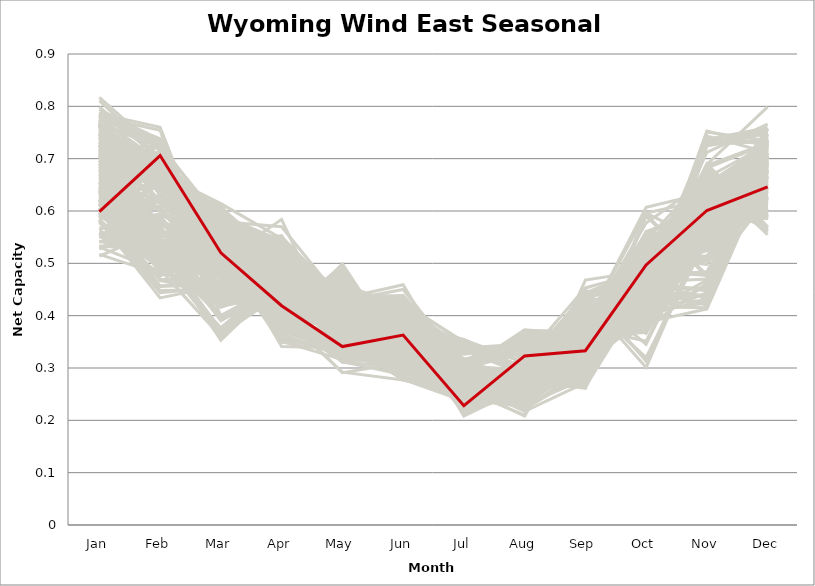
| Category | sample_001 | sample_002 | sample_003 | sample_004 | sample_005 | sample_006 | sample_007 | sample_008 | sample_009 | sample_010 | sample_011 | sample_012 | sample_013 | sample_014 | sample_015 | sample_016 | sample_017 | sample_018 | sample_019 | sample_020 | sample_021 | sample_022 | sample_023 | sample_024 | sample_025 | sample_026 | sample_027 | sample_028 | sample_029 | sample_030 | sample_031 | sample_032 | sample_033 | sample_034 | sample_035 | sample_036 | sample_037 | sample_038 | sample_039 | sample_040 | sample_041 | sample_042 | sample_043 | sample_044 | sample_045 | sample_046 | sample_047 | sample_048 | sample_049 | sample_050 | sample_051 | sample_052 | sample_053 | sample_054 | sample_055 | sample_056 | sample_057 | sample_058 | sample_059 | sample_060 | sample_061 | sample_062 | sample_063 | sample_064 | sample_065 | sample_066 | sample_067 | sample_068 | sample_069 | sample_070 | sample_071 | sample_072 | sample_073 | sample_074 | sample_075 | sample_076 | sample_077 | sample_078 | sample_079 | sample_080 | sample_081 | sample_082 | sample_083 | sample_084 | sample_085 | sample_086 | sample_087 | sample_088 | sample_089 | sample_090 | sample_091 | sample_092 | sample_093 | sample_094 | sample_095 | sample_096 | sample_097 | sample_098 | sample_099 | sample_100 | sample_101 | sample_102 | sample_103 | sample_104 | sample_105 | sample_106 | sample_107 | sample_108 | sample_109 | sample_110 | sample_111 | sample_112 | sample_113 | sample_114 | sample_115 | sample_116 | sample_117 | sample_118 | sample_119 | sample_120 | sample_121 | sample_122 | sample_123 | sample_124 | sample_125 | sample_126 | sample_127 | sample_128 | sample_129 | sample_130 | sample_131 | sample_132 | sample_133 | sample_134 | sample_135 | sample_136 | sample_137 | sample_138 | sample_139 | sample_140 | sample_141 | sample_142 | sample_143 | sample_144 | sample_145 | sample_146 | sample_147 | sample_148 | sample_149 | sample_150 | sample_151 | sample_152 | sample_153 | sample_154 | sample_155 | sample_156 | sample_157 | sample_158 | sample_159 | sample_160 | sample_161 | sample_162 | sample_163 | sample_164 | sample_165 | sample_166 | sample_167 | sample_168 | sample_169 | sample_170 | sample_171 | sample_172 | sample_173 | sample_174 | sample_175 | sample_176 | sample_177 | sample_178 | sample_179 | sample_180 | sample_181 | sample_182 | sample_183 | sample_184 | sample_185 | sample_186 | sample_187 | sample_188 | sample_189 | sample_190 | sample_191 | sample_192 | sample_193 | sample_194 | sample_195 | sample_196 | sample_197 | sample_198 | sample_199 | sample_200 | sample_201 | sample_202 | sample_203 | sample_204 | sample_205 | sample_206 | sample_207 | sample_208 | sample_209 | sample_210 | sample_211 | sample_212 | sample_213 | sample_214 | sample_215 | sample_216 | sample_217 | sample_218 | sample_219 | sample_220 | sample_221 | sample_222 | sample_223 | sample_224 | sample_225 | sample_226 | sample_227 | sample_228 | sample_229 | sample_230 | sample_231 | sample_232 | sample_233 | sample_234 | sample_235 | sample_236 | sample_237 | sample_238 | sample_239 | sample_240 | sample_241 | sample_242 | sample_243 | sample_244 | sample_245 | sample_246 | sample_248 | sample_249 | sample_250 | sample_247 |
|---|---|---|---|---|---|---|---|---|---|---|---|---|---|---|---|---|---|---|---|---|---|---|---|---|---|---|---|---|---|---|---|---|---|---|---|---|---|---|---|---|---|---|---|---|---|---|---|---|---|---|---|---|---|---|---|---|---|---|---|---|---|---|---|---|---|---|---|---|---|---|---|---|---|---|---|---|---|---|---|---|---|---|---|---|---|---|---|---|---|---|---|---|---|---|---|---|---|---|---|---|---|---|---|---|---|---|---|---|---|---|---|---|---|---|---|---|---|---|---|---|---|---|---|---|---|---|---|---|---|---|---|---|---|---|---|---|---|---|---|---|---|---|---|---|---|---|---|---|---|---|---|---|---|---|---|---|---|---|---|---|---|---|---|---|---|---|---|---|---|---|---|---|---|---|---|---|---|---|---|---|---|---|---|---|---|---|---|---|---|---|---|---|---|---|---|---|---|---|---|---|---|---|---|---|---|---|---|---|---|---|---|---|---|---|---|---|---|---|---|---|---|---|---|---|---|---|---|---|---|---|---|---|---|---|---|---|---|---|---|---|---|---|---|---|---|---|---|---|---|---|
| Jan | 0.687 | 0.639 | 0.761 | 0.761 | 0.686 | 0.67 | 0.596 | 0.608 | 0.719 | 0.738 | 0.794 | 0.636 | 0.711 | 0.769 | 0.618 | 0.581 | 0.551 | 0.711 | 0.587 | 0.767 | 0.692 | 0.613 | 0.584 | 0.584 | 0.602 | 0.644 | 0.75 | 0.753 | 0.583 | 0.78 | 0.705 | 0.767 | 0.54 | 0.733 | 0.623 | 0.639 | 0.621 | 0.578 | 0.646 | 0.641 | 0.751 | 0.717 | 0.75 | 0.582 | 0.789 | 0.622 | 0.617 | 0.593 | 0.71 | 0.652 | 0.638 | 0.637 | 0.671 | 0.696 | 0.551 | 0.639 | 0.62 | 0.782 | 0.752 | 0.763 | 0.532 | 0.542 | 0.616 | 0.799 | 0.649 | 0.765 | 0.756 | 0.559 | 0.531 | 0.726 | 0.71 | 0.674 | 0.751 | 0.714 | 0.69 | 0.787 | 0.747 | 0.732 | 0.718 | 0.718 | 0.593 | 0.722 | 0.747 | 0.609 | 0.666 | 0.746 | 0.718 | 0.751 | 0.733 | 0.742 | 0.731 | 0.614 | 0.615 | 0.615 | 0.746 | 0.817 | 0.592 | 0.717 | 0.658 | 0.654 | 0.731 | 0.65 | 0.766 | 0.765 | 0.754 | 0.756 | 0.623 | 0.634 | 0.527 | 0.639 | 0.618 | 0.599 | 0.629 | 0.6 | 0.724 | 0.71 | 0.771 | 0.747 | 0.775 | 0.739 | 0.777 | 0.671 | 0.558 | 0.635 | 0.621 | 0.613 | 0.737 | 0.678 | 0.722 | 0.727 | 0.591 | 0.727 | 0.662 | 0.589 | 0.735 | 0.672 | 0.622 | 0.675 | 0.686 | 0.708 | 0.647 | 0.641 | 0.756 | 0.625 | 0.707 | 0.766 | 0.728 | 0.74 | 0.782 | 0.597 | 0.594 | 0.606 | 0.778 | 0.627 | 0.588 | 0.657 | 0.587 | 0.731 | 0.746 | 0.67 | 0.533 | 0.612 | 0.713 | 0.688 | 0.697 | 0.604 | 0.702 | 0.601 | 0.607 | 0.633 | 0.685 | 0.666 | 0.708 | 0.761 | 0.724 | 0.681 | 0.715 | 0.787 | 0.677 | 0.656 | 0.596 | 0.706 | 0.655 | 0.784 | 0.72 | 0.743 | 0.72 | 0.707 | 0.732 | 0.655 | 0.563 | 0.586 | 0.786 | 0.663 | 0.56 | 0.618 | 0.583 | 0.605 | 0.589 | 0.719 | 0.705 | 0.542 | 0.69 | 0.673 | 0.517 | 0.724 | 0.748 | 0.73 | 0.615 | 0.689 | 0.733 | 0.643 | 0.588 | 0.697 | 0.759 | 0.632 | 0.766 | 0.514 | 0.615 | 0.625 | 0.78 | 0.678 | 0.551 | 0.733 | 0.706 | 0.725 | 0.766 | 0.708 | 0.708 | 0.6 | 0.658 | 0.725 | 0.725 | 0.811 | 0.745 | 0.567 | 0.748 | 0.677 | 0.697 | 0.587 | 0.595 | 0.751 | 0.602 | 0.763 | 0.661 | 0.62 | 0.733 | 0.639 | 0.785 | 0.599 |
| Feb | 0.668 | 0.511 | 0.691 | 0.676 | 0.677 | 0.713 | 0.509 | 0.699 | 0.709 | 0.601 | 0.736 | 0.538 | 0.663 | 0.681 | 0.715 | 0.434 | 0.624 | 0.652 | 0.692 | 0.727 | 0.538 | 0.524 | 0.444 | 0.651 | 0.659 | 0.519 | 0.671 | 0.66 | 0.47 | 0.754 | 0.574 | 0.522 | 0.592 | 0.664 | 0.512 | 0.541 | 0.489 | 0.456 | 0.528 | 0.673 | 0.662 | 0.66 | 0.683 | 0.476 | 0.718 | 0.508 | 0.712 | 0.69 | 0.529 | 0.497 | 0.53 | 0.528 | 0.614 | 0.674 | 0.514 | 0.698 | 0.697 | 0.738 | 0.679 | 0.527 | 0.542 | 0.516 | 0.528 | 0.697 | 0.582 | 0.617 | 0.639 | 0.501 | 0.485 | 0.648 | 0.671 | 0.57 | 0.683 | 0.505 | 0.519 | 0.725 | 0.486 | 0.66 | 0.725 | 0.573 | 0.698 | 0.702 | 0.662 | 0.713 | 0.581 | 0.681 | 0.561 | 0.674 | 0.684 | 0.505 | 0.672 | 0.542 | 0.496 | 0.488 | 0.663 | 0.714 | 0.687 | 0.518 | 0.67 | 0.512 | 0.639 | 0.712 | 0.722 | 0.485 | 0.679 | 0.701 | 0.502 | 0.521 | 0.594 | 0.682 | 0.585 | 0.706 | 0.671 | 0.691 | 0.657 | 0.559 | 0.521 | 0.688 | 0.515 | 0.648 | 0.725 | 0.493 | 0.48 | 0.536 | 0.505 | 0.467 | 0.647 | 0.509 | 0.662 | 0.67 | 0.698 | 0.55 | 0.681 | 0.653 | 0.676 | 0.67 | 0.537 | 0.669 | 0.599 | 0.662 | 0.512 | 0.518 | 0.683 | 0.703 | 0.683 | 0.667 | 0.654 | 0.68 | 0.676 | 0.539 | 0.495 | 0.513 | 0.694 | 0.521 | 0.688 | 0.7 | 0.569 | 0.653 | 0.67 | 0.708 | 0.525 | 0.658 | 0.686 | 0.657 | 0.555 | 0.457 | 0.571 | 0.448 | 0.456 | 0.694 | 0.504 | 0.529 | 0.525 | 0.521 | 0.616 | 0.524 | 0.709 | 0.704 | 0.508 | 0.5 | 0.49 | 0.52 | 0.534 | 0.63 | 0.689 | 0.69 | 0.523 | 0.64 | 0.664 | 0.622 | 0.629 | 0.631 | 0.76 | 0.643 | 0.542 | 0.488 | 0.489 | 0.469 | 0.532 | 0.69 | 0.544 | 0.531 | 0.556 | 0.729 | 0.479 | 0.647 | 0.674 | 0.639 | 0.66 | 0.725 | 0.669 | 0.503 | 0.607 | 0.544 | 0.67 | 0.489 | 0.532 | 0.564 | 0.488 | 0.618 | 0.652 | 0.649 | 0.518 | 0.659 | 0.654 | 0.647 | 0.646 | 0.711 | 0.662 | 0.609 | 0.726 | 0.574 | 0.533 | 0.702 | 0.679 | 0.595 | 0.658 | 0.684 | 0.545 | 0.704 | 0.685 | 0.67 | 0.486 | 0.506 | 0.538 | 0.529 | 0.659 | 0.522 | 0.731 | 0.706 |
| Mar | 0.482 | 0.517 | 0.428 | 0.542 | 0.529 | 0.56 | 0.364 | 0.539 | 0.579 | 0.524 | 0.435 | 0.4 | 0.538 | 0.399 | 0.535 | 0.458 | 0.537 | 0.52 | 0.526 | 0.435 | 0.529 | 0.367 | 0.455 | 0.558 | 0.565 | 0.459 | 0.565 | 0.59 | 0.466 | 0.433 | 0.528 | 0.555 | 0.429 | 0.573 | 0.512 | 0.393 | 0.438 | 0.478 | 0.432 | 0.512 | 0.559 | 0.577 | 0.548 | 0.523 | 0.447 | 0.366 | 0.534 | 0.527 | 0.582 | 0.499 | 0.361 | 0.353 | 0.548 | 0.535 | 0.527 | 0.519 | 0.533 | 0.479 | 0.603 | 0.584 | 0.393 | 0.487 | 0.4 | 0.505 | 0.439 | 0.611 | 0.5 | 0.543 | 0.485 | 0.536 | 0.566 | 0.435 | 0.567 | 0.602 | 0.534 | 0.441 | 0.606 | 0.58 | 0.581 | 0.535 | 0.561 | 0.57 | 0.52 | 0.537 | 0.537 | 0.602 | 0.549 | 0.525 | 0.584 | 0.553 | 0.614 | 0.39 | 0.477 | 0.432 | 0.562 | 0.497 | 0.527 | 0.605 | 0.535 | 0.503 | 0.502 | 0.539 | 0.429 | 0.575 | 0.582 | 0.57 | 0.377 | 0.514 | 0.392 | 0.527 | 0.468 | 0.515 | 0.513 | 0.541 | 0.521 | 0.524 | 0.573 | 0.571 | 0.575 | 0.59 | 0.423 | 0.523 | 0.542 | 0.51 | 0.441 | 0.448 | 0.56 | 0.511 | 0.571 | 0.571 | 0.523 | 0.551 | 0.549 | 0.552 | 0.576 | 0.574 | 0.365 | 0.59 | 0.491 | 0.562 | 0.515 | 0.437 | 0.555 | 0.55 | 0.545 | 0.607 | 0.541 | 0.577 | 0.418 | 0.355 | 0.451 | 0.398 | 0.43 | 0.442 | 0.556 | 0.54 | 0.433 | 0.576 | 0.549 | 0.568 | 0.495 | 0.485 | 0.55 | 0.524 | 0.556 | 0.456 | 0.553 | 0.45 | 0.463 | 0.534 | 0.569 | 0.514 | 0.529 | 0.582 | 0.527 | 0.571 | 0.554 | 0.441 | 0.53 | 0.517 | 0.417 | 0.547 | 0.522 | 0.594 | 0.589 | 0.592 | 0.557 | 0.504 | 0.558 | 0.523 | 0.528 | 0.515 | 0.463 | 0.58 | 0.513 | 0.417 | 0.57 | 0.448 | 0.369 | 0.596 | 0.538 | 0.416 | 0.562 | 0.57 | 0.502 | 0.561 | 0.593 | 0.502 | 0.575 | 0.578 | 0.522 | 0.51 | 0.479 | 0.527 | 0.553 | 0.418 | 0.555 | 0.418 | 0.36 | 0.483 | 0.42 | 0.535 | 0.489 | 0.559 | 0.522 | 0.549 | 0.612 | 0.544 | 0.538 | 0.472 | 0.504 | 0.529 | 0.586 | 0.51 | 0.574 | 0.526 | 0.553 | 0.543 | 0.525 | 0.523 | 0.548 | 0.581 | 0.541 | 0.568 | 0.542 | 0.373 | 0.551 | 0.529 | 0.435 | 0.52 |
| Apr | 0.447 | 0.434 | 0.447 | 0.416 | 0.514 | 0.505 | 0.442 | 0.358 | 0.526 | 0.455 | 0.452 | 0.457 | 0.395 | 0.434 | 0.406 | 0.472 | 0.463 | 0.427 | 0.403 | 0.464 | 0.395 | 0.461 | 0.467 | 0.402 | 0.415 | 0.461 | 0.518 | 0.518 | 0.49 | 0.459 | 0.397 | 0.46 | 0.427 | 0.429 | 0.402 | 0.455 | 0.463 | 0.478 | 0.451 | 0.388 | 0.538 | 0.498 | 0.397 | 0.364 | 0.449 | 0.454 | 0.415 | 0.351 | 0.386 | 0.382 | 0.458 | 0.465 | 0.479 | 0.545 | 0.374 | 0.385 | 0.37 | 0.493 | 0.495 | 0.498 | 0.437 | 0.415 | 0.463 | 0.509 | 0.482 | 0.432 | 0.461 | 0.369 | 0.419 | 0.553 | 0.404 | 0.465 | 0.517 | 0.396 | 0.39 | 0.456 | 0.399 | 0.507 | 0.51 | 0.413 | 0.409 | 0.508 | 0.439 | 0.377 | 0.463 | 0.5 | 0.428 | 0.426 | 0.454 | 0.448 | 0.547 | 0.457 | 0.457 | 0.462 | 0.537 | 0.515 | 0.417 | 0.392 | 0.493 | 0.392 | 0.427 | 0.546 | 0.469 | 0.45 | 0.522 | 0.524 | 0.475 | 0.399 | 0.446 | 0.364 | 0.488 | 0.411 | 0.349 | 0.341 | 0.418 | 0.393 | 0.501 | 0.515 | 0.479 | 0.441 | 0.456 | 0.382 | 0.376 | 0.428 | 0.473 | 0.463 | 0.497 | 0.392 | 0.409 | 0.422 | 0.417 | 0.427 | 0.531 | 0.422 | 0.503 | 0.527 | 0.456 | 0.528 | 0.412 | 0.416 | 0.391 | 0.454 | 0.546 | 0.385 | 0.41 | 0.504 | 0.53 | 0.446 | 0.444 | 0.492 | 0.476 | 0.445 | 0.45 | 0.467 | 0.419 | 0.541 | 0.399 | 0.485 | 0.548 | 0.46 | 0.398 | 0.393 | 0.414 | 0.526 | 0.457 | 0.462 | 0.462 | 0.466 | 0.478 | 0.412 | 0.38 | 0.405 | 0.4 | 0.463 | 0.439 | 0.409 | 0.506 | 0.454 | 0.405 | 0.368 | 0.452 | 0.378 | 0.404 | 0.443 | 0.536 | 0.543 | 0.449 | 0.401 | 0.533 | 0.466 | 0.47 | 0.493 | 0.485 | 0.57 | 0.393 | 0.456 | 0.366 | 0.473 | 0.486 | 0.515 | 0.376 | 0.461 | 0.458 | 0.508 | 0.373 | 0.491 | 0.434 | 0.407 | 0.42 | 0.529 | 0.404 | 0.391 | 0.481 | 0.394 | 0.549 | 0.452 | 0.451 | 0.441 | 0.47 | 0.516 | 0.459 | 0.506 | 0.407 | 0.536 | 0.503 | 0.508 | 0.459 | 0.523 | 0.53 | 0.487 | 0.584 | 0.438 | 0.413 | 0.485 | 0.527 | 0.466 | 0.538 | 0.523 | 0.399 | 0.372 | 0.354 | 0.448 | 0.369 | 0.444 | 0.406 | 0.483 | 0.551 | 0.405 | 0.461 | 0.419 |
| May | 0.415 | 0.454 | 0.349 | 0.333 | 0.371 | 0.447 | 0.465 | 0.33 | 0.441 | 0.339 | 0.381 | 0.434 | 0.361 | 0.353 | 0.334 | 0.398 | 0.376 | 0.312 | 0.325 | 0.385 | 0.466 | 0.466 | 0.403 | 0.34 | 0.312 | 0.375 | 0.436 | 0.426 | 0.403 | 0.368 | 0.434 | 0.389 | 0.427 | 0.393 | 0.479 | 0.429 | 0.411 | 0.388 | 0.393 | 0.318 | 0.435 | 0.411 | 0.356 | 0.426 | 0.35 | 0.461 | 0.33 | 0.316 | 0.345 | 0.499 | 0.462 | 0.465 | 0.341 | 0.373 | 0.433 | 0.314 | 0.331 | 0.337 | 0.417 | 0.365 | 0.395 | 0.389 | 0.421 | 0.326 | 0.399 | 0.422 | 0.356 | 0.441 | 0.384 | 0.37 | 0.37 | 0.375 | 0.416 | 0.322 | 0.486 | 0.375 | 0.347 | 0.416 | 0.435 | 0.438 | 0.322 | 0.43 | 0.323 | 0.34 | 0.355 | 0.424 | 0.33 | 0.32 | 0.397 | 0.374 | 0.407 | 0.449 | 0.409 | 0.413 | 0.372 | 0.35 | 0.337 | 0.313 | 0.388 | 0.497 | 0.352 | 0.349 | 0.374 | 0.402 | 0.428 | 0.431 | 0.448 | 0.469 | 0.436 | 0.324 | 0.38 | 0.32 | 0.338 | 0.338 | 0.328 | 0.47 | 0.36 | 0.421 | 0.371 | 0.405 | 0.378 | 0.48 | 0.429 | 0.454 | 0.409 | 0.406 | 0.394 | 0.489 | 0.376 | 0.383 | 0.33 | 0.332 | 0.364 | 0.322 | 0.434 | 0.374 | 0.452 | 0.403 | 0.439 | 0.388 | 0.483 | 0.402 | 0.428 | 0.345 | 0.373 | 0.443 | 0.428 | 0.401 | 0.356 | 0.448 | 0.409 | 0.445 | 0.349 | 0.372 | 0.323 | 0.348 | 0.292 | 0.404 | 0.429 | 0.438 | 0.414 | 0.325 | 0.363 | 0.384 | 0.348 | 0.386 | 0.358 | 0.4 | 0.419 | 0.327 | 0.327 | 0.494 | 0.458 | 0.364 | 0.433 | 0.311 | 0.437 | 0.351 | 0.477 | 0.486 | 0.418 | 0.47 | 0.466 | 0.409 | 0.315 | 0.427 | 0.356 | 0.329 | 0.418 | 0.334 | 0.371 | 0.37 | 0.35 | 0.426 | 0.421 | 0.404 | 0.418 | 0.404 | 0.451 | 0.366 | 0.458 | 0.392 | 0.363 | 0.434 | 0.425 | 0.421 | 0.4 | 0.336 | 0.334 | 0.441 | 0.344 | 0.478 | 0.36 | 0.469 | 0.432 | 0.406 | 0.392 | 0.401 | 0.447 | 0.362 | 0.344 | 0.391 | 0.408 | 0.428 | 0.39 | 0.37 | 0.419 | 0.425 | 0.37 | 0.368 | 0.334 | 0.343 | 0.342 | 0.358 | 0.412 | 0.4 | 0.442 | 0.366 | 0.459 | 0.341 | 0.338 | 0.408 | 0.426 | 0.381 | 0.291 | 0.456 | 0.431 | 0.468 | 0.377 | 0.341 |
| Jun | 0.362 | 0.326 | 0.283 | 0.295 | 0.372 | 0.379 | 0.393 | 0.338 | 0.43 | 0.308 | 0.297 | 0.386 | 0.311 | 0.277 | 0.363 | 0.357 | 0.369 | 0.287 | 0.364 | 0.299 | 0.357 | 0.402 | 0.355 | 0.382 | 0.363 | 0.385 | 0.405 | 0.419 | 0.359 | 0.285 | 0.431 | 0.37 | 0.383 | 0.299 | 0.322 | 0.379 | 0.368 | 0.362 | 0.373 | 0.316 | 0.412 | 0.407 | 0.306 | 0.341 | 0.283 | 0.397 | 0.363 | 0.341 | 0.304 | 0.322 | 0.406 | 0.393 | 0.368 | 0.386 | 0.39 | 0.349 | 0.346 | 0.343 | 0.4 | 0.404 | 0.387 | 0.369 | 0.364 | 0.352 | 0.32 | 0.293 | 0.302 | 0.345 | 0.376 | 0.389 | 0.317 | 0.313 | 0.414 | 0.325 | 0.335 | 0.281 | 0.303 | 0.41 | 0.42 | 0.438 | 0.363 | 0.399 | 0.306 | 0.339 | 0.369 | 0.413 | 0.312 | 0.302 | 0.314 | 0.371 | 0.435 | 0.388 | 0.377 | 0.367 | 0.396 | 0.351 | 0.364 | 0.321 | 0.377 | 0.323 | 0.303 | 0.366 | 0.278 | 0.376 | 0.45 | 0.424 | 0.413 | 0.319 | 0.371 | 0.352 | 0.363 | 0.355 | 0.349 | 0.329 | 0.309 | 0.368 | 0.403 | 0.439 | 0.367 | 0.301 | 0.28 | 0.319 | 0.35 | 0.328 | 0.37 | 0.36 | 0.393 | 0.315 | 0.311 | 0.321 | 0.37 | 0.3 | 0.37 | 0.368 | 0.417 | 0.355 | 0.385 | 0.35 | 0.433 | 0.332 | 0.323 | 0.38 | 0.42 | 0.35 | 0.312 | 0.341 | 0.417 | 0.299 | 0.279 | 0.424 | 0.359 | 0.384 | 0.28 | 0.391 | 0.37 | 0.364 | 0.277 | 0.4 | 0.404 | 0.355 | 0.371 | 0.323 | 0.314 | 0.381 | 0.357 | 0.357 | 0.366 | 0.356 | 0.36 | 0.378 | 0.307 | 0.316 | 0.367 | 0.356 | 0.459 | 0.302 | 0.4 | 0.279 | 0.349 | 0.317 | 0.367 | 0.392 | 0.324 | 0.294 | 0.377 | 0.436 | 0.36 | 0.302 | 0.409 | 0.364 | 0.373 | 0.366 | 0.323 | 0.381 | 0.369 | 0.368 | 0.36 | 0.355 | 0.426 | 0.371 | 0.387 | 0.385 | 0.37 | 0.379 | 0.333 | 0.403 | 0.293 | 0.307 | 0.392 | 0.429 | 0.3 | 0.316 | 0.378 | 0.365 | 0.414 | 0.382 | 0.377 | 0.395 | 0.421 | 0.35 | 0.294 | 0.381 | 0.371 | 0.427 | 0.376 | 0.39 | 0.298 | 0.4 | 0.375 | 0.38 | 0.349 | 0.311 | 0.305 | 0.337 | 0.438 | 0.378 | 0.423 | 0.377 | 0.419 | 0.333 | 0.345 | 0.292 | 0.346 | 0.367 | 0.31 | 0.413 | 0.428 | 0.329 | 0.291 | 0.363 |
| Jul | 0.276 | 0.282 | 0.247 | 0.268 | 0.243 | 0.296 | 0.352 | 0.222 | 0.229 | 0.272 | 0.242 | 0.348 | 0.259 | 0.252 | 0.215 | 0.314 | 0.271 | 0.272 | 0.217 | 0.237 | 0.27 | 0.341 | 0.295 | 0.233 | 0.246 | 0.288 | 0.297 | 0.221 | 0.296 | 0.237 | 0.257 | 0.27 | 0.309 | 0.25 | 0.291 | 0.343 | 0.317 | 0.291 | 0.308 | 0.235 | 0.314 | 0.218 | 0.272 | 0.248 | 0.244 | 0.332 | 0.214 | 0.239 | 0.256 | 0.286 | 0.342 | 0.334 | 0.247 | 0.244 | 0.256 | 0.23 | 0.237 | 0.24 | 0.213 | 0.277 | 0.302 | 0.271 | 0.344 | 0.248 | 0.263 | 0.272 | 0.283 | 0.247 | 0.267 | 0.244 | 0.244 | 0.258 | 0.292 | 0.266 | 0.282 | 0.243 | 0.269 | 0.229 | 0.231 | 0.261 | 0.224 | 0.225 | 0.275 | 0.221 | 0.255 | 0.22 | 0.266 | 0.267 | 0.254 | 0.249 | 0.303 | 0.354 | 0.299 | 0.333 | 0.234 | 0.247 | 0.222 | 0.259 | 0.234 | 0.289 | 0.275 | 0.261 | 0.237 | 0.243 | 0.304 | 0.317 | 0.334 | 0.29 | 0.299 | 0.243 | 0.243 | 0.22 | 0.237 | 0.231 | 0.273 | 0.268 | 0.283 | 0.306 | 0.244 | 0.265 | 0.25 | 0.291 | 0.248 | 0.291 | 0.327 | 0.315 | 0.224 | 0.279 | 0.24 | 0.243 | 0.218 | 0.263 | 0.263 | 0.244 | 0.302 | 0.26 | 0.354 | 0.244 | 0.27 | 0.258 | 0.29 | 0.31 | 0.301 | 0.222 | 0.258 | 0.297 | 0.288 | 0.261 | 0.255 | 0.35 | 0.291 | 0.347 | 0.246 | 0.288 | 0.231 | 0.264 | 0.29 | 0.208 | 0.291 | 0.305 | 0.262 | 0.244 | 0.255 | 0.233 | 0.254 | 0.285 | 0.255 | 0.296 | 0.301 | 0.221 | 0.256 | 0.282 | 0.265 | 0.252 | 0.264 | 0.257 | 0.284 | 0.247 | 0.274 | 0.278 | 0.338 | 0.269 | 0.284 | 0.27 | 0.274 | 0.313 | 0.258 | 0.278 | 0.299 | 0.246 | 0.272 | 0.262 | 0.235 | 0.233 | 0.257 | 0.327 | 0.247 | 0.31 | 0.347 | 0.292 | 0.263 | 0.294 | 0.254 | 0.292 | 0.244 | 0.225 | 0.269 | 0.267 | 0.236 | 0.231 | 0.272 | 0.3 | 0.24 | 0.264 | 0.29 | 0.316 | 0.268 | 0.316 | 0.337 | 0.24 | 0.249 | 0.244 | 0.267 | 0.296 | 0.241 | 0.235 | 0.273 | 0.289 | 0.243 | 0.239 | 0.27 | 0.272 | 0.278 | 0.237 | 0.297 | 0.275 | 0.315 | 0.241 | 0.268 | 0.224 | 0.228 | 0.266 | 0.243 | 0.247 | 0.251 | 0.341 | 0.295 | 0.289 | 0.243 | 0.228 |
| Aug | 0.3 | 0.283 | 0.254 | 0.258 | 0.286 | 0.29 | 0.311 | 0.326 | 0.243 | 0.257 | 0.26 | 0.321 | 0.269 | 0.248 | 0.318 | 0.353 | 0.226 | 0.257 | 0.331 | 0.267 | 0.297 | 0.294 | 0.371 | 0.317 | 0.305 | 0.279 | 0.265 | 0.263 | 0.373 | 0.266 | 0.296 | 0.252 | 0.249 | 0.274 | 0.281 | 0.312 | 0.334 | 0.362 | 0.267 | 0.31 | 0.269 | 0.261 | 0.264 | 0.285 | 0.249 | 0.301 | 0.317 | 0.314 | 0.255 | 0.291 | 0.291 | 0.305 | 0.266 | 0.278 | 0.275 | 0.303 | 0.309 | 0.256 | 0.257 | 0.252 | 0.229 | 0.287 | 0.327 | 0.244 | 0.208 | 0.268 | 0.249 | 0.28 | 0.286 | 0.279 | 0.277 | 0.21 | 0.263 | 0.234 | 0.292 | 0.267 | 0.253 | 0.262 | 0.238 | 0.296 | 0.311 | 0.245 | 0.258 | 0.318 | 0.27 | 0.266 | 0.271 | 0.26 | 0.272 | 0.26 | 0.277 | 0.31 | 0.33 | 0.341 | 0.279 | 0.259 | 0.316 | 0.233 | 0.276 | 0.291 | 0.25 | 0.304 | 0.27 | 0.267 | 0.27 | 0.271 | 0.287 | 0.291 | 0.24 | 0.302 | 0.23 | 0.322 | 0.303 | 0.322 | 0.263 | 0.303 | 0.25 | 0.28 | 0.248 | 0.261 | 0.266 | 0.292 | 0.287 | 0.279 | 0.336 | 0.358 | 0.28 | 0.296 | 0.271 | 0.269 | 0.324 | 0.261 | 0.298 | 0.303 | 0.274 | 0.299 | 0.299 | 0.303 | 0.286 | 0.263 | 0.29 | 0.279 | 0.262 | 0.328 | 0.272 | 0.28 | 0.276 | 0.262 | 0.251 | 0.29 | 0.363 | 0.321 | 0.256 | 0.277 | 0.314 | 0.303 | 0.291 | 0.265 | 0.281 | 0.295 | 0.284 | 0.318 | 0.273 | 0.286 | 0.256 | 0.369 | 0.257 | 0.36 | 0.36 | 0.323 | 0.245 | 0.288 | 0.294 | 0.256 | 0.284 | 0.24 | 0.288 | 0.255 | 0.298 | 0.298 | 0.346 | 0.292 | 0.283 | 0.265 | 0.283 | 0.276 | 0.262 | 0.27 | 0.266 | 0.282 | 0.217 | 0.222 | 0.257 | 0.324 | 0.276 | 0.337 | 0.284 | 0.349 | 0.294 | 0.269 | 0.291 | 0.233 | 0.257 | 0.285 | 0.299 | 0.272 | 0.262 | 0.26 | 0.31 | 0.243 | 0.261 | 0.291 | 0.235 | 0.296 | 0.271 | 0.266 | 0.256 | 0.223 | 0.292 | 0.226 | 0.244 | 0.274 | 0.293 | 0.277 | 0.279 | 0.288 | 0.266 | 0.29 | 0.276 | 0.234 | 0.313 | 0.263 | 0.256 | 0.26 | 0.281 | 0.229 | 0.264 | 0.28 | 0.294 | 0.327 | 0.325 | 0.271 | 0.287 | 0.263 | 0.227 | 0.287 | 0.277 | 0.29 | 0.271 | 0.323 |
| Sep | 0.409 | 0.344 | 0.373 | 0.356 | 0.265 | 0.303 | 0.432 | 0.381 | 0.31 | 0.359 | 0.354 | 0.412 | 0.332 | 0.383 | 0.362 | 0.382 | 0.286 | 0.383 | 0.364 | 0.353 | 0.379 | 0.426 | 0.37 | 0.333 | 0.329 | 0.34 | 0.334 | 0.297 | 0.364 | 0.361 | 0.386 | 0.332 | 0.292 | 0.281 | 0.374 | 0.406 | 0.383 | 0.356 | 0.334 | 0.433 | 0.339 | 0.307 | 0.35 | 0.403 | 0.369 | 0.434 | 0.352 | 0.438 | 0.357 | 0.383 | 0.427 | 0.428 | 0.299 | 0.266 | 0.414 | 0.444 | 0.43 | 0.325 | 0.292 | 0.331 | 0.308 | 0.364 | 0.402 | 0.331 | 0.412 | 0.27 | 0.34 | 0.392 | 0.365 | 0.261 | 0.308 | 0.468 | 0.334 | 0.348 | 0.379 | 0.361 | 0.344 | 0.296 | 0.316 | 0.372 | 0.339 | 0.318 | 0.366 | 0.391 | 0.316 | 0.296 | 0.351 | 0.37 | 0.285 | 0.329 | 0.317 | 0.407 | 0.364 | 0.383 | 0.267 | 0.324 | 0.336 | 0.35 | 0.284 | 0.381 | 0.359 | 0.35 | 0.365 | 0.318 | 0.317 | 0.323 | 0.428 | 0.367 | 0.293 | 0.437 | 0.375 | 0.36 | 0.435 | 0.423 | 0.376 | 0.38 | 0.328 | 0.331 | 0.296 | 0.274 | 0.363 | 0.37 | 0.392 | 0.347 | 0.374 | 0.381 | 0.286 | 0.386 | 0.306 | 0.295 | 0.362 | 0.355 | 0.356 | 0.325 | 0.333 | 0.336 | 0.422 | 0.319 | 0.401 | 0.297 | 0.374 | 0.328 | 0.331 | 0.386 | 0.343 | 0.327 | 0.33 | 0.268 | 0.378 | 0.435 | 0.375 | 0.41 | 0.385 | 0.339 | 0.332 | 0.353 | 0.378 | 0.305 | 0.328 | 0.313 | 0.386 | 0.453 | 0.331 | 0.267 | 0.323 | 0.362 | 0.32 | 0.376 | 0.384 | 0.336 | 0.344 | 0.383 | 0.373 | 0.307 | 0.397 | 0.348 | 0.303 | 0.372 | 0.38 | 0.384 | 0.391 | 0.378 | 0.365 | 0.27 | 0.342 | 0.327 | 0.323 | 0.383 | 0.339 | 0.31 | 0.272 | 0.29 | 0.328 | 0.32 | 0.396 | 0.381 | 0.403 | 0.379 | 0.433 | 0.351 | 0.371 | 0.307 | 0.325 | 0.295 | 0.425 | 0.303 | 0.274 | 0.377 | 0.324 | 0.306 | 0.363 | 0.37 | 0.333 | 0.381 | 0.324 | 0.325 | 0.336 | 0.299 | 0.444 | 0.373 | 0.382 | 0.284 | 0.367 | 0.333 | 0.264 | 0.275 | 0.264 | 0.313 | 0.266 | 0.356 | 0.362 | 0.353 | 0.346 | 0.316 | 0.319 | 0.28 | 0.329 | 0.265 | 0.384 | 0.401 | 0.418 | 0.268 | 0.387 | 0.314 | 0.342 | 0.45 | 0.34 | 0.367 | 0.356 | 0.333 |
| Oct | 0.372 | 0.527 | 0.555 | 0.509 | 0.518 | 0.514 | 0.381 | 0.488 | 0.408 | 0.404 | 0.543 | 0.389 | 0.509 | 0.596 | 0.516 | 0.418 | 0.508 | 0.511 | 0.489 | 0.53 | 0.425 | 0.373 | 0.418 | 0.498 | 0.51 | 0.372 | 0.437 | 0.44 | 0.419 | 0.549 | 0.409 | 0.484 | 0.482 | 0.471 | 0.479 | 0.398 | 0.412 | 0.438 | 0.399 | 0.504 | 0.446 | 0.452 | 0.504 | 0.468 | 0.557 | 0.366 | 0.518 | 0.47 | 0.469 | 0.467 | 0.37 | 0.383 | 0.52 | 0.495 | 0.389 | 0.488 | 0.478 | 0.5 | 0.442 | 0.453 | 0.594 | 0.368 | 0.403 | 0.496 | 0.497 | 0.452 | 0.39 | 0.46 | 0.388 | 0.51 | 0.489 | 0.486 | 0.45 | 0.507 | 0.453 | 0.561 | 0.464 | 0.455 | 0.421 | 0.402 | 0.499 | 0.422 | 0.5 | 0.476 | 0.519 | 0.453 | 0.454 | 0.513 | 0.483 | 0.515 | 0.436 | 0.395 | 0.433 | 0.403 | 0.489 | 0.491 | 0.492 | 0.508 | 0.544 | 0.448 | 0.398 | 0.421 | 0.544 | 0.515 | 0.431 | 0.428 | 0.32 | 0.485 | 0.524 | 0.498 | 0.467 | 0.497 | 0.488 | 0.464 | 0.487 | 0.419 | 0.456 | 0.428 | 0.541 | 0.455 | 0.55 | 0.459 | 0.468 | 0.51 | 0.416 | 0.399 | 0.465 | 0.443 | 0.496 | 0.492 | 0.509 | 0.461 | 0.423 | 0.525 | 0.431 | 0.435 | 0.378 | 0.438 | 0.387 | 0.502 | 0.464 | 0.38 | 0.459 | 0.489 | 0.482 | 0.437 | 0.483 | 0.486 | 0.577 | 0.316 | 0.417 | 0.385 | 0.556 | 0.38 | 0.499 | 0.433 | 0.351 | 0.451 | 0.487 | 0.516 | 0.379 | 0.485 | 0.49 | 0.496 | 0.524 | 0.425 | 0.524 | 0.412 | 0.418 | 0.516 | 0.489 | 0.455 | 0.438 | 0.538 | 0.376 | 0.523 | 0.483 | 0.552 | 0.449 | 0.445 | 0.397 | 0.403 | 0.477 | 0.471 | 0.474 | 0.435 | 0.532 | 0.494 | 0.454 | 0.544 | 0.523 | 0.509 | 0.512 | 0.417 | 0.399 | 0.404 | 0.432 | 0.406 | 0.301 | 0.471 | 0.403 | 0.596 | 0.516 | 0.51 | 0.458 | 0.455 | 0.474 | 0.493 | 0.503 | 0.398 | 0.484 | 0.463 | 0.491 | 0.417 | 0.468 | 0.392 | 0.46 | 0.59 | 0.345 | 0.474 | 0.607 | 0.511 | 0.374 | 0.437 | 0.508 | 0.463 | 0.451 | 0.487 | 0.5 | 0.472 | 0.423 | 0.444 | 0.466 | 0.5 | 0.449 | 0.499 | 0.453 | 0.517 | 0.396 | 0.49 | 0.466 | 0.482 | 0.467 | 0.528 | 0.533 | 0.313 | 0.455 | 0.476 | 0.557 | 0.497 |
| Nov | 0.55 | 0.498 | 0.617 | 0.573 | 0.616 | 0.672 | 0.538 | 0.602 | 0.618 | 0.602 | 0.579 | 0.592 | 0.531 | 0.622 | 0.63 | 0.635 | 0.589 | 0.527 | 0.608 | 0.58 | 0.439 | 0.566 | 0.61 | 0.576 | 0.565 | 0.682 | 0.666 | 0.623 | 0.617 | 0.597 | 0.424 | 0.596 | 0.514 | 0.541 | 0.481 | 0.586 | 0.626 | 0.62 | 0.641 | 0.627 | 0.681 | 0.581 | 0.546 | 0.729 | 0.624 | 0.561 | 0.623 | 0.609 | 0.619 | 0.432 | 0.577 | 0.563 | 0.682 | 0.618 | 0.738 | 0.632 | 0.633 | 0.662 | 0.603 | 0.6 | 0.474 | 0.727 | 0.585 | 0.639 | 0.572 | 0.511 | 0.627 | 0.712 | 0.751 | 0.642 | 0.524 | 0.557 | 0.687 | 0.651 | 0.453 | 0.604 | 0.629 | 0.597 | 0.604 | 0.43 | 0.618 | 0.584 | 0.559 | 0.598 | 0.674 | 0.609 | 0.636 | 0.557 | 0.563 | 0.62 | 0.62 | 0.568 | 0.651 | 0.585 | 0.634 | 0.662 | 0.613 | 0.622 | 0.614 | 0.438 | 0.594 | 0.603 | 0.595 | 0.603 | 0.671 | 0.66 | 0.546 | 0.477 | 0.513 | 0.65 | 0.585 | 0.612 | 0.603 | 0.61 | 0.525 | 0.43 | 0.602 | 0.665 | 0.608 | 0.533 | 0.591 | 0.448 | 0.737 | 0.498 | 0.612 | 0.625 | 0.606 | 0.436 | 0.506 | 0.562 | 0.62 | 0.616 | 0.586 | 0.569 | 0.677 | 0.621 | 0.554 | 0.604 | 0.413 | 0.571 | 0.47 | 0.652 | 0.68 | 0.633 | 0.536 | 0.563 | 0.677 | 0.542 | 0.659 | 0.567 | 0.623 | 0.553 | 0.608 | 0.687 | 0.633 | 0.602 | 0.573 | 0.571 | 0.682 | 0.644 | 0.737 | 0.63 | 0.538 | 0.592 | 0.657 | 0.615 | 0.665 | 0.614 | 0.608 | 0.65 | 0.634 | 0.42 | 0.437 | 0.633 | 0.462 | 0.613 | 0.66 | 0.575 | 0.421 | 0.438 | 0.581 | 0.468 | 0.484 | 0.533 | 0.675 | 0.614 | 0.657 | 0.506 | 0.674 | 0.669 | 0.576 | 0.59 | 0.629 | 0.57 | 0.743 | 0.609 | 0.753 | 0.631 | 0.568 | 0.623 | 0.457 | 0.538 | 0.665 | 0.662 | 0.689 | 0.567 | 0.553 | 0.514 | 0.594 | 0.593 | 0.526 | 0.449 | 0.602 | 0.415 | 0.686 | 0.664 | 0.592 | 0.478 | 0.584 | 0.584 | 0.635 | 0.607 | 0.724 | 0.684 | 0.585 | 0.614 | 0.533 | 0.67 | 0.628 | 0.587 | 0.644 | 0.593 | 0.625 | 0.618 | 0.643 | 0.572 | 0.688 | 0.646 | 0.444 | 0.601 | 0.615 | 0.547 | 0.733 | 0.601 | 0.634 | 0.554 | 0.69 | 0.511 | 0.619 | 0.601 |
| Dec | 0.653 | 0.675 | 0.622 | 0.644 | 0.748 | 0.638 | 0.624 | 0.694 | 0.664 | 0.689 | 0.614 | 0.607 | 0.64 | 0.613 | 0.652 | 0.641 | 0.619 | 0.671 | 0.666 | 0.638 | 0.712 | 0.601 | 0.685 | 0.687 | 0.673 | 0.729 | 0.569 | 0.717 | 0.676 | 0.606 | 0.704 | 0.668 | 0.627 | 0.646 | 0.679 | 0.605 | 0.607 | 0.667 | 0.726 | 0.713 | 0.562 | 0.747 | 0.638 | 0.756 | 0.614 | 0.607 | 0.66 | 0.684 | 0.733 | 0.732 | 0.614 | 0.599 | 0.6 | 0.745 | 0.728 | 0.695 | 0.679 | 0.613 | 0.691 | 0.659 | 0.625 | 0.733 | 0.597 | 0.607 | 0.683 | 0.662 | 0.687 | 0.766 | 0.734 | 0.728 | 0.646 | 0.736 | 0.587 | 0.707 | 0.712 | 0.601 | 0.725 | 0.731 | 0.655 | 0.693 | 0.661 | 0.69 | 0.668 | 0.686 | 0.597 | 0.68 | 0.696 | 0.658 | 0.624 | 0.625 | 0.596 | 0.608 | 0.613 | 0.607 | 0.742 | 0.594 | 0.634 | 0.721 | 0.736 | 0.728 | 0.666 | 0.697 | 0.634 | 0.663 | 0.567 | 0.561 | 0.604 | 0.686 | 0.621 | 0.69 | 0.686 | 0.658 | 0.695 | 0.682 | 0.679 | 0.705 | 0.664 | 0.555 | 0.64 | 0.657 | 0.603 | 0.707 | 0.759 | 0.68 | 0.607 | 0.64 | 0.738 | 0.724 | 0.643 | 0.638 | 0.663 | 0.698 | 0.69 | 0.667 | 0.589 | 0.631 | 0.615 | 0.624 | 0.677 | 0.621 | 0.691 | 0.727 | 0.586 | 0.692 | 0.652 | 0.705 | 0.584 | 0.619 | 0.6 | 0.587 | 0.676 | 0.63 | 0.622 | 0.73 | 0.655 | 0.697 | 0.619 | 0.747 | 0.591 | 0.682 | 0.732 | 0.704 | 0.644 | 0.758 | 0.611 | 0.684 | 0.602 | 0.667 | 0.667 | 0.647 | 0.731 | 0.718 | 0.702 | 0.586 | 0.665 | 0.728 | 0.642 | 0.62 | 0.724 | 0.736 | 0.591 | 0.692 | 0.692 | 0.635 | 0.589 | 0.568 | 0.606 | 0.676 | 0.594 | 0.585 | 0.598 | 0.63 | 0.618 | 0.594 | 0.712 | 0.61 | 0.724 | 0.646 | 0.611 | 0.645 | 0.694 | 0.624 | 0.597 | 0.646 | 0.799 | 0.756 | 0.642 | 0.676 | 0.667 | 0.673 | 0.666 | 0.709 | 0.671 | 0.704 | 0.589 | 0.727 | 0.684 | 0.628 | 0.591 | 0.676 | 0.635 | 0.734 | 0.748 | 0.594 | 0.758 | 0.735 | 0.649 | 0.628 | 0.74 | 0.68 | 0.671 | 0.691 | 0.703 | 0.634 | 0.561 | 0.634 | 0.567 | 0.73 | 0.698 | 0.696 | 0.693 | 0.645 | 0.75 | 0.639 | 0.735 | 0.61 | 0.57 | 0.692 | 0.596 | 0.646 |